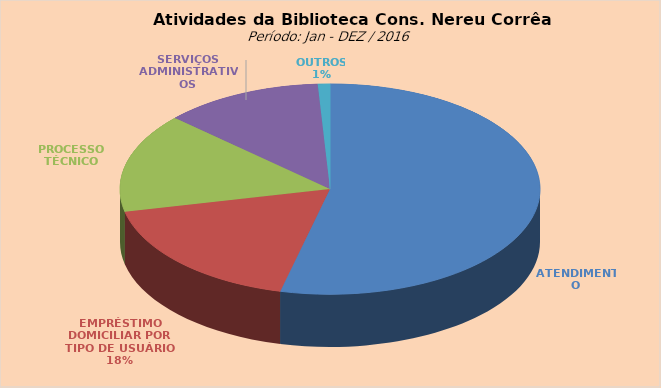
| Category | Series 0 |
|---|---|
| ATENDIMENTO | 17876 |
| EMPRÉSTIMO DOMICILIAR POR TIPO DE USUÁRIO | 5893 |
| PROCESSO TÉCNICO | 5073 |
| SERVIÇOS ADMINISTRATIVOS | 4075 |
| OUTROS | 310 |